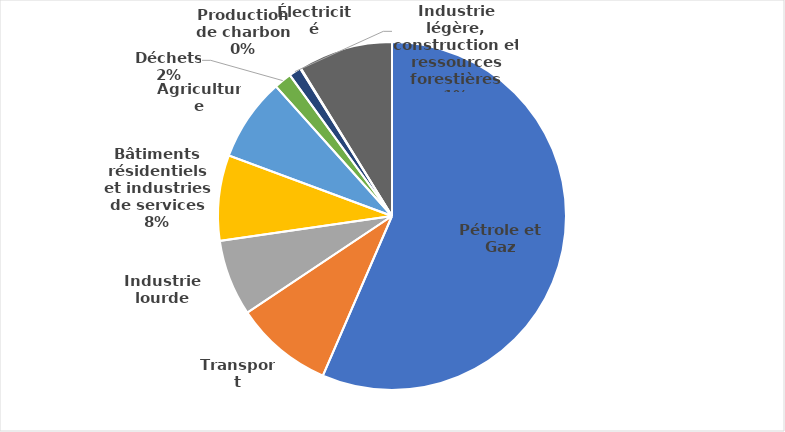
| Category | CO2éq |
|---|---|
| Pétrole et Gaz | 144.729 |
| Transport | 23.374 |
| Industrie lourde | 18.142 |
| Bâtiments résidentiels et industries de services | 20.355 |
| Agriculture | 19.763 |
| Déchets | 4.198 |
| Industrie légère, construction et ressources forestières | 2.889 |
| Production de charbon | 0.164 |
| Électricité | 22.535 |